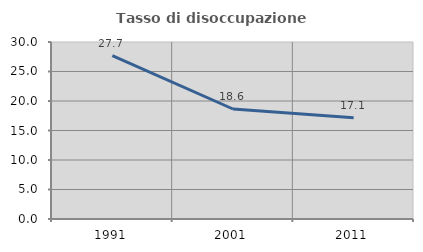
| Category | Tasso di disoccupazione giovanile  |
|---|---|
| 1991.0 | 27.679 |
| 2001.0 | 18.644 |
| 2011.0 | 17.143 |